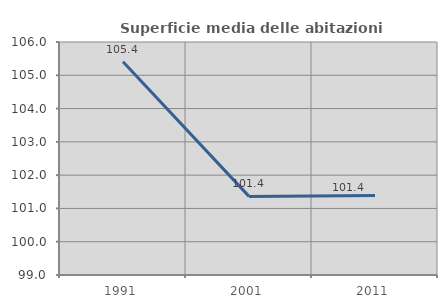
| Category | Superficie media delle abitazioni occupate |
|---|---|
| 1991.0 | 105.407 |
| 2001.0 | 101.361 |
| 2011.0 | 101.385 |